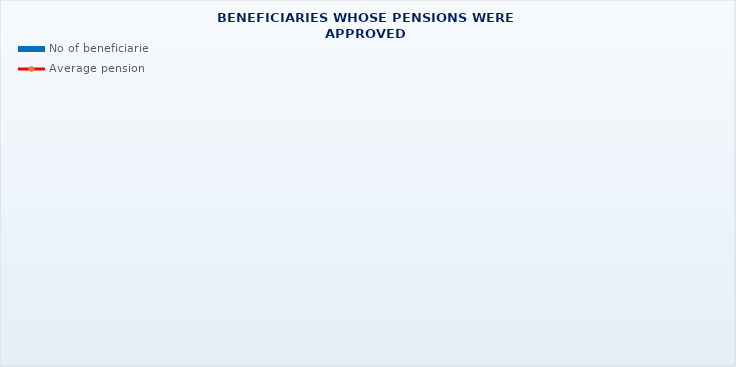
| Category | No of beneficiaries |
|---|---|
| Authorised officials in internal affairs, judicial officers and workers engaged in demining work: | 17264 |
| Active military personnel - DVO  | 15702 |
| Croatian Homeland Army veterans mobilised from 1941 to 1945 | 3837 |
| Former political prisoners | 2763 |
| Croatian Veterans from the Homeland War - ZOHBDR (Act on the Rights of Croatian Homeland War Veterans and their Family Members) | 71180 |
| Pensions approved under general regulations and determined according to the Act on the Rights of Croatian Homeland War Veterans and their Family Members (ZOHBDR), in 2017 (Art. 27, 35, 48 and 49, paragraph 2)    | 43860 |
| Former Yugoslav People's Army members - JNA   | 5289 |
| Former Yugoslav People's Army members - JNA - Art. 185 of Pension Insurance Act (ZOMO)  | 142 |
| National Liberation War veterans - NOR | 9216 |
| Members of the Croatian Parliament, members of the Government, judges of the Constitutional Court and the Auditor General | 674 |
| Members of the Parliamentary Executive Council and administratively retired federal civil servants  (relates to the former SFRY) | 92 |
| Former officials of federal bodies o the former SFRJ -  Article 38 of the Pension Insurance Act (ZOMO) | 30 |
| Full members of the Croatian Academy of Sciences and Arts - HAZU | 140 |
| Miners from the Istrian coal mines "Tupljak" d.d. Labin  | 254 |
| Workers professionally exposed to asbestos | 865 |
| Insurees - crew members on a ship in international and national navigation  - Article  129, paragraph 2 of the Maritime Code | 183 |
| Members of the Croatian Defence Council - HVO  | 6683 |